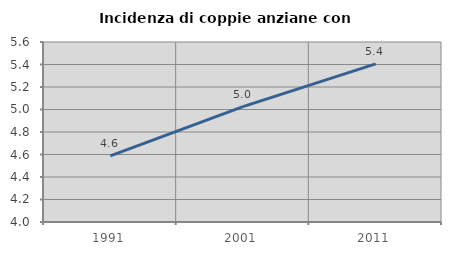
| Category | Incidenza di coppie anziane con figli |
|---|---|
| 1991.0 | 4.587 |
| 2001.0 | 5.025 |
| 2011.0 | 5.405 |